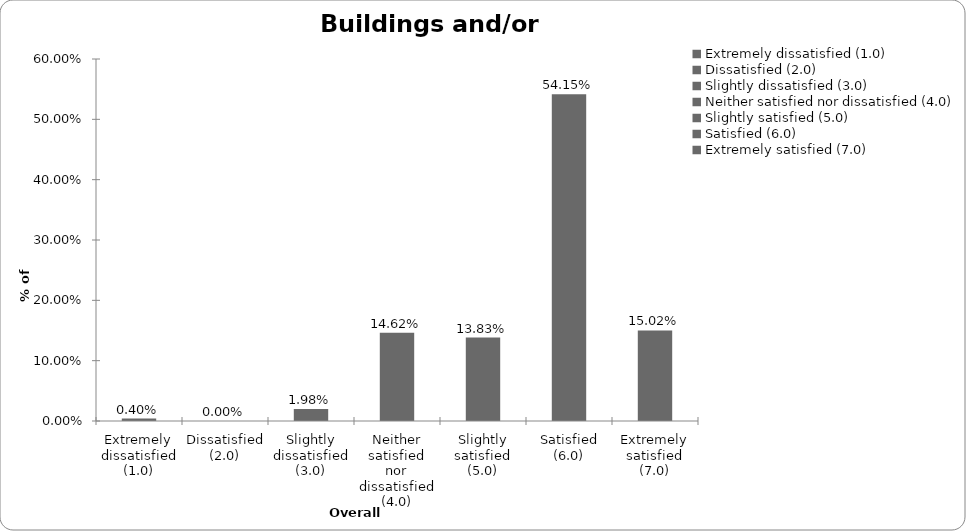
| Category | Series 0 |
|---|---|
| Extremely dissatisfied (1.0) | 0.004 |
| Dissatisfied (2.0) | 0 |
| Slightly dissatisfied (3.0) | 0.02 |
| Neither satisfied nor dissatisfied (4.0) | 0.146 |
| Slightly satisfied (5.0) | 0.138 |
| Satisfied (6.0) | 0.542 |
| Extremely satisfied (7.0) | 0.15 |